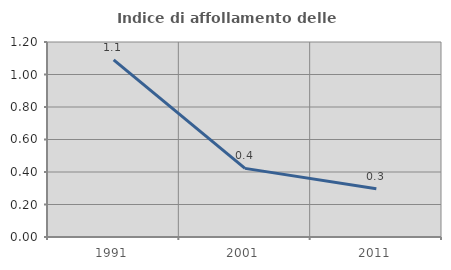
| Category | Indice di affollamento delle abitazioni  |
|---|---|
| 1991.0 | 1.09 |
| 2001.0 | 0.422 |
| 2011.0 | 0.297 |